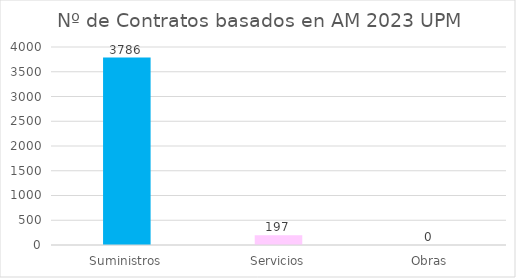
| Category | Series 0 |
|---|---|
| Suministros | 3786 |
| Servicios | 197 |
| Obras | 0 |